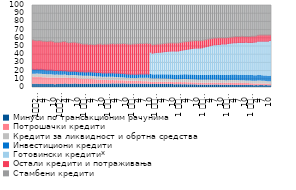
| Category | Минуси по трансакционим рачунима | Потрошачки кредити | Кредити за ликвидност и обртна средства | Инвестициони кредити | Готовински кредити* | Остали кредити и потраживања | Стамбени кредити  |
|---|---|---|---|---|---|---|---|
| 1
2010. | 4.063 | 8.368 | 3.88 | 5.988 | 0 | 35.521 | 42.181 |
| 2 | 3.832 | 8.428 | 3.853 | 5.909 | 0 | 35.379 | 42.598 |
| 3 | 3.883 | 8.573 | 3.858 | 5.797 | 0 | 34.931 | 42.958 |
| 4 | 3.804 | 8.508 | 3.981 | 5.781 | 0 | 35.106 | 42.82 |
| 5 | 3.815 | 8.389 | 4.039 | 6.09 | 0 | 34.682 | 42.985 |
| 6 | 3.623 | 8.282 | 3.974 | 5.926 | 0 | 34.539 | 43.655 |
| 7 | 3.581 | 8.176 | 3.963 | 5.873 | 0 | 34.916 | 43.491 |
| 8 | 3.685 | 7.992 | 3.943 | 5.849 | 0 | 34.759 | 43.771 |
| 9 | 3.65 | 7.923 | 3.897 | 5.837 | 0 | 35.039 | 43.655 |
| 10 | 3.651 | 7.886 | 3.892 | 5.789 | 0 | 35.337 | 43.445 |
| 11 | 3.722 | 7.749 | 3.884 | 5.677 | 0 | 34.933 | 44.034 |
| 12 | 3.492 | 7.661 | 3.883 | 5.598 | 0 | 34.508 | 44.857 |
| 1
2011. | 3.745 | 7.551 | 3.829 | 5.552 | 0 | 34.658 | 44.665 |
| 2 | 3.66 | 7.49 | 3.813 | 5.488 | 0 | 34.814 | 44.735 |
| 3 | 3.816 | 7.415 | 3.861 | 5.552 | 0 | 34.883 | 44.474 |
| 4 | 3.733 | 7.49 | 3.86 | 5.451 | 0 | 35.492 | 43.974 |
| 5 | 4.149 | 7.316 | 3.779 | 5.329 | 0 | 35.489 | 43.938 |
| 6 | 3.884 | 7.253 | 3.642 | 5.385 | 0 | 34.98 | 44.857 |
| 7 | 3.811 | 7.084 | 3.521 | 5.306 | 0 | 34.838 | 45.441 |
| 8 | 3.983 | 7.027 | 3.514 | 5.298 | 0 | 35.028 | 45.15 |
| 9 | 3.997 | 6.941 | 3.563 | 5.26 | 0 | 35.357 | 44.882 |
| 10 | 4.169 | 6.814 | 3.582 | 5.198 | 0 | 35.512 | 44.724 |
| 11 | 4.043 | 6.7 | 3.575 | 5.29 | 0 | 35.041 | 45.351 |
| 12 | 3.695 | 6.619 | 3.662 | 5.256 | 0 | 34.905 | 45.863 |
| 1 
2012. | 3.928 | 6.458 | 3.636 | 5.325 | 0 | 34.412 | 46.241 |
| 2 | 3.764 | 6.336 | 3.632 | 5.331 | 0 | 33.894 | 47.044 |
| 3 | 3.873 | 6.213 | 3.649 | 5.285 | 0 | 33.959 | 47.021 |
| 4 | 3.832 | 6.11 | 3.719 | 5.32 | 0 | 33.993 | 47.026 |
| 5 | 3.92 | 6.004 | 3.745 | 5.392 | 0 | 33.461 | 47.478 |
| 6 | 3.868 | 6.004 | 3.757 | 5.445 | 0 | 33.673 | 47.253 |
| 7 | 3.925 | 5.725 | 3.718 | 5.489 | 0 | 33.609 | 47.534 |
| 8 | 3.948 | 5.571 | 3.635 | 5.462 | 0 | 33.658 | 47.727 |
| 9 | 4.062 | 5.109 | 3.643 | 5.439 | 0 | 34.558 | 47.188 |
| 10 | 4.19 | 4.907 | 3.738 | 5.413 | 0 | 34.902 | 46.849 |
| 11 | 4.137 | 4.781 | 3.813 | 5.386 | 0 | 34.982 | 46.901 |
| 12 | 3.91 | 4.673 | 3.767 | 5.323 | 0 | 34.875 | 47.451 |
| 1 
2013. | 4.222 | 4.56 | 3.759 | 5.27 | 0 | 35.195 | 46.995 |
| 2 | 4.087 | 4.436 | 3.844 | 5.284 | 0 | 35.196 | 47.154 |
| 3 | 4.139 | 4.32 | 4.066 | 5.321 | 0 | 35.162 | 46.992 |
| 4 | 4.107 | 4.286 | 4.071 | 5.307 | 0 | 35.63 | 46.6 |
| 5 | 4.342 | 4.217 | 4.014 | 5.303 | 0 | 35.699 | 46.424 |
| 6 | 4.138 | 4.162 | 3.965 | 5.339 | 0 | 35.526 | 46.87 |
| 7 | 4.26 | 4.098 | 3.854 | 5.335 | 0 | 35.805 | 46.646 |
| 8 | 4.203 | 4.045 | 3.785 | 5.379 | 0 | 35.978 | 46.609 |
| 9 | 4.231 | 3.965 | 3.683 | 5.381 | 0 | 36.166 | 46.574 |
| 10 | 4.351 | 3.884 | 3.588 | 5.341 | 0 | 36.513 | 46.323 |
| 11 | 4.232 | 3.819 | 3.499 | 5.321 | 0 | 36.682 | 46.447 |
| 12 | 3.96 | 3.758 | 3.469 | 5.29 | 0 | 36.749 | 46.773 |
| 1 
2014. | 4.165 | 3.666 | 3.389 | 5.268 | 0 | 36.453 | 47.059 |
| 2 | 3.934 | 3.59 | 3.39 | 5.282 | 0 | 36.553 | 47.251 |
| 3 | 4.062 | 3.532 | 3.439 | 5.245 | 0 | 36.769 | 46.952 |
| 4 | 3.986 | 3.477 | 3.463 | 5.223 | 0 | 37.024 | 46.827 |
| 5 | 4.052 | 3.398 | 3.46 | 5.208 | 0 | 37.215 | 46.666 |
| 6 | 4.017 | 3.334 | 3.784 | 5.214 | 0 | 37.265 | 46.387 |
| 7 | 3.987 | 3.274 | 4 | 5.199 | 0 | 37.324 | 46.215 |
| 8 | 3.905 | 3.226 | 4.077 | 5.22 | 0 | 37.249 | 46.324 |
| 9 | 3.931 | 3.167 | 4.141 | 5.211 | 0 | 37.38 | 46.169 |
| 10 | 3.944 | 3.132 | 4.242 | 5.19 | 0 | 37.48 | 46.012 |
| 11 | 3.803 | 3.094 | 4.256 | 5.227 | 0 | 37.302 | 46.318 |
| 12 | 3.593 | 2.758 | 4.312 | 5.177 | 27.268 | 10.388 | 46.503 |
| 1 
2015. | 3.68 | 2.666 | 4.078 | 5.082 | 26.354 | 10.156 | 47.984 |
| 2 | 3.68 | 2.636 | 4.031 | 5.061 | 26.953 | 10.236 | 47.403 |
| 3 | 3.816 | 2.624 | 4.019 | 5.061 | 27.133 | 10.171 | 47.176 |
| 4 | 3.77 | 2.655 | 3.966 | 5.104 | 27.364 | 10.165 | 46.976 |
| 5 | 3.771 | 2.654 | 3.9 | 5.138 | 27.538 | 10.115 | 46.884 |
| 6 | 3.769 | 2.659 | 3.858 | 5.222 | 27.8 | 10.099 | 46.593 |
| 7 | 3.755 | 2.66 | 3.8 | 5.254 | 28.248 | 10.065 | 46.218 |
| 8 | 3.761 | 2.662 | 3.731 | 5.284 | 28.475 | 10.081 | 46.005 |
| 9 | 3.744 | 2.663 | 3.663 | 5.332 | 28.805 | 10.072 | 45.721 |
| 10 | 3.739 | 2.658 | 3.597 | 5.409 | 28.932 | 9.968 | 45.698 |
| 11 | 3.653 | 2.641 | 3.526 | 5.498 | 29.138 | 9.932 | 45.612 |
| 12 | 3.347 | 2.613 | 3.467 | 5.566 | 29.421 | 9.933 | 45.649 |
| 1 
2016. | 3.487 | 2.574 | 3.425 | 5.607 | 29.262 | 9.924 | 45.716 |
| 2 | 3.463 | 2.543 | 3.469 | 5.628 | 29.355 | 9.889 | 45.65 |
| 3 | 3.482 | 2.554 | 3.579 | 5.73 | 29.744 | 9.823 | 45.083 |
| 4 | 3.304 | 2.581 | 3.677 | 5.763 | 30.184 | 9.771 | 44.715 |
| 5 | 3.452 | 2.573 | 3.732 | 5.799 | 30.471 | 9.655 | 44.312 |
| 6 | 3.352 | 2.548 | 3.752 | 5.829 | 30.93 | 9.544 | 44.038 |
| 7 | 3.239 | 2.51 | 3.765 | 5.816 | 31.445 | 9.433 | 43.782 |
| 8 | 3.306 | 2.465 | 3.728 | 5.799 | 31.92 | 9.39 | 43.384 |
| 9 | 3.233 | 2.425 | 3.674 | 5.873 | 32.338 | 9.252 | 43.197 |
| 10 | 3.236 | 2.379 | 3.641 | 5.884 | 32.771 | 9.185 | 42.895 |
| 11 | 3.153 | 2.345 | 3.655 | 5.903 | 32.994 | 9.133 | 42.808 |
| 12 | 2.855 | 2.336 | 3.685 | 5.89 | 33.314 | 9.007 | 42.905 |
| 1 
2017. | 3.056 | 2.3 | 3.623 | 5.861 | 33.261 | 8.941 | 42.95 |
| 2 | 2.952 | 2.267 | 3.65 | 5.866 | 33.677 | 8.854 | 42.727 |
| 3 | 2.94 | 2.253 | 3.73 | 5.959 | 34.275 | 8.713 | 42.123 |
| 4 | 2.831 | 2.28 | 3.748 | 6.005 | 34.848 | 8.661 | 41.619 |
| 5 | 2.976 | 2.289 | 3.688 | 6.048 | 35.259 | 8.663 | 41.069 |
| 6 | 2.91 | 2.307 | 3.655 | 6.153 | 35.92 | 8.46 | 40.588 |
| 7 | 2.932 | 2.336 | 3.629 | 6.201 | 36.428 | 8.382 | 40.085 |
| 8 | 2.986 | 2.37 | 3.614 | 6.222 | 36.909 | 8.346 | 39.547 |
| 9 | 2.899 | 2.33 | 3.517 | 6.276 | 37.163 | 8.041 | 39.769 |
| 10 | 2.964 | 2.364 | 3.504 | 6.303 | 37.353 | 8.033 | 39.473 |
| 11 | 2.885 | 2.395 | 3.348 | 6.332 | 37.611 | 7.957 | 39.467 |
| 12 | 2.598 | 2.402 | 3.422 | 6.399 | 38.273 | 7.543 | 39.358 |
| 1 
2018. | 2.761 | 2.379 | 3.353 | 6.375 | 38.144 | 7.645 | 39.338 |
| 2 | 2.644 | 2.39 | 3.35 | 6.392 | 38.363 | 7.627 | 39.228 |
| 3 | 2.65 | 2.435 | 3.374 | 6.477 | 38.578 | 7.479 | 39.002 |
| 4 | 2.56 | 2.495 | 3.408 | 6.533 | 38.919 | 7.457 | 38.624 |
| 5 | 2.648 | 2.519 | 3.413 | 6.553 | 39.03 | 7.455 | 38.378 |
| 6 | 2.523 | 2.547 | 3.441 | 6.602 | 39.336 | 7.375 | 38.173 |
| 7 | 2.546 | 2.556 | 3.389 | 6.632 | 39.569 | 7.353 | 37.951 |
| 8 | 2.505 | 2.564 | 3.344 | 6.65 | 39.678 | 7.326 | 37.93 |
| 9 | 2.47 | 2.518 | 3.315 | 6.659 | 39.866 | 7.302 | 37.867 |
| 10 | 2.544 | 2.502 | 3.265 | 6.661 | 40.055 | 7.326 | 37.644 |
| 11 | 2.396 | 2.472 | 3.249 | 6.712 | 40.155 | 7.346 | 37.667 |
| 12 | 2.305 | 2.456 | 3.265 | 6.754 | 40.283 | 7.194 | 37.739 |
| 1 
2019. | 2.426 | 2.426 | 3.227 | 6.727 | 40.165 | 7.219 | 37.81 |
| 2 | 2.336 | 2.382 | 3.228 | 6.741 | 40.234 | 7.255 | 37.824 |
| 3 | 2.326 | 2.153 | 3.253 | 6.77 | 40.512 | 7.379 | 37.608 |
| 4 | 2.25 | 2.163 | 3.353 | 6.675 | 40.747 | 7.379 | 37.434 |
| 5 | 2.296 | 2.064 | 3.371 | 6.655 | 41.027 | 7.418 | 37.17 |
| 6 | 2.281 | 2.078 | 3.443 | 6.774 | 41.678 | 7.539 | 36.208 |
| 7 | 2.313 | 2.031 | 3.439 | 6.722 | 41.93 | 7.575 | 35.989 |
| 8 | 2.287 | 1.903 | 3.425 | 6.693 | 42.122 | 7.546 | 36.023 |
| 9 | 2.282 | 1.849 | 3.351 | 6.661 | 42.318 | 7.563 | 35.976 |
| 10 | 2.297 | 1.748 | 3.34 | 6.68 | 42.369 | 7.636 | 35.931 |
| 11 | 2.214 | 1.625 | 3.187 | 6.777 | 42.503 | 7.636 | 36.057 |
| 12 | 2.069 | 1.601 | 3.263 | 6.7 | 43.651 | 6.67 | 36.046 |